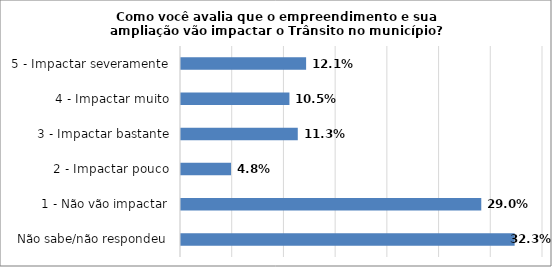
| Category | Series 0 |
|---|---|
| Não sabe/não respondeu | 0.323 |
| 1 - Não vão impactar | 0.29 |
| 2 - Impactar pouco | 0.048 |
| 3 - Impactar bastante | 0.113 |
| 4 - Impactar muito | 0.105 |
| 5 - Impactar severamente | 0.121 |